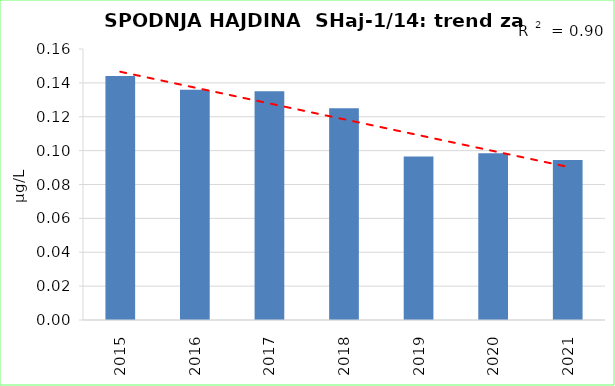
| Category | Vsota |
|---|---|
| 2015 | 0.144 |
| 2016 | 0.136 |
| 2017 | 0.135 |
| 2018 | 0.125 |
| 2019 | 0.096 |
| 2020 | 0.098 |
| 2021 | 0.094 |